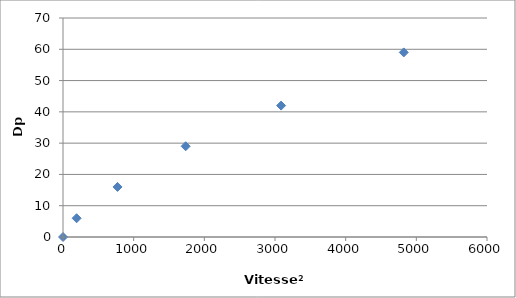
| Category | Series 0 |
|---|---|
| 0.0 | 0 |
| 192.90123456790124 | 6 |
| 771.604938271605 | 16 |
| 1736.1111111111109 | 29 |
| 3086.41975308642 | 42 |
| 4822.530864197531 | 59 |